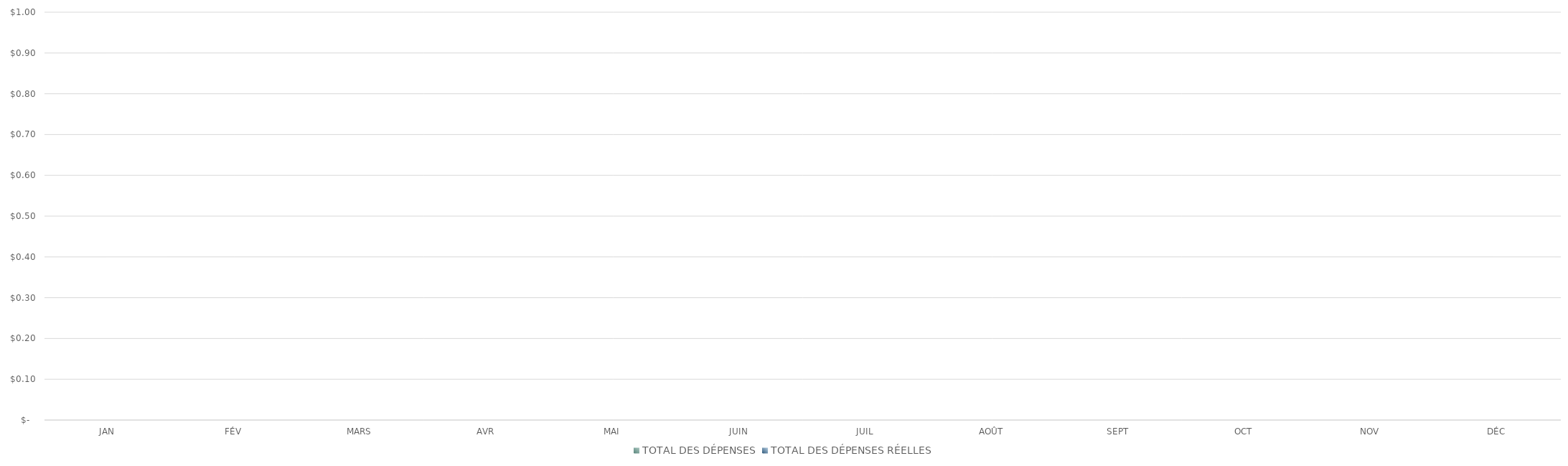
| Category | TOTAL DES DÉPENSES | TOTAL DES DÉPENSES RÉELLES |
|---|---|---|
| JAN | 0 | 0 |
| FÉV | 0 | 0 |
| MARS | 0 | 0 |
| AVR | 0 | 0 |
| MAI | 0 | 0 |
| JUIN | 0 | 0 |
| JUIL | 0 | 0 |
| AOÛT | 0 | 0 |
| SEPT | 0 | 0 |
| OCT | 0 | 0 |
| NOV | 0 | 0 |
| DÉC | 0 | 0 |